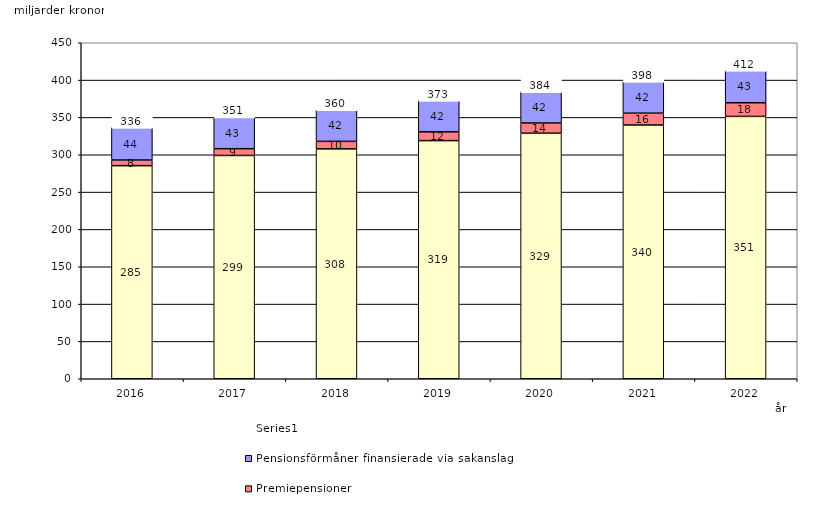
| Category | Inkomstpension och tilläggspension m.m. | Premiepensioner | Pensionsförmåner finansierade via sakanslag | Series 0 |
|---|---|---|---|---|
| 2016.0 | 285.357 | 7.598 | 43.541 | 20 |
| 2017.0 | 299.057 | 9.081 | 42.508 | 20 |
| 2018.0 | 307.832 | 10.107 | 42.327 | 20 |
| 2019.0 | 318.937 | 11.767 | 41.965 | 20 |
| 2020.0 | 328.855 | 13.657 | 41.992 | 20 |
| 2021.0 | 339.822 | 15.876 | 42.434 | 20 |
| 2022.0 | 351.371 | 18.277 | 43.027 | 20 |